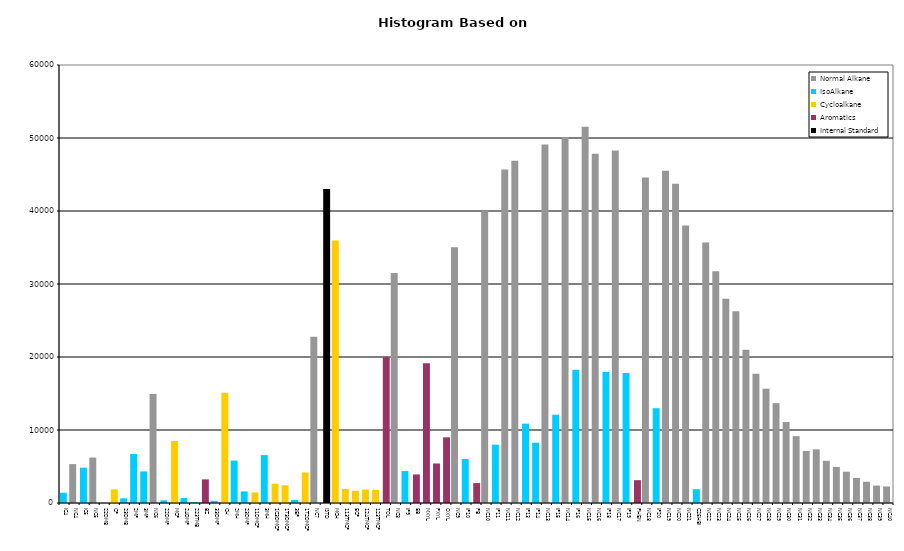
| Category | Normal Alkane | IsoAlkane | Cycloalkane | Aromatics | Internal Standard |
|---|---|---|---|---|---|
| IC4 | 0 | 1407 | 0 | 0 | 0 |
| NC4 | 5330 | 0 | 0 | 0 | 0 |
| IC5 | 0 | 4836 | 0 | 0 | 0 |
| NC5 | 6226 | 0 | 0 | 0 | 0 |
| 22DMB | 0 | 0 | 0 | 0 | 0 |
| CP | 0 | 0 | 1866 | 0 | 0 |
| 23DMB | 0 | 638 | 0 | 0 | 0 |
| 2MP | 0 | 6716 | 0 | 0 | 0 |
| 3MP | 0 | 4327 | 0 | 0 | 0 |
| NC6 | 14945 | 0 | 0 | 0 | 0 |
| 22DMP | 0 | 363 | 0 | 0 | 0 |
| MCP | 0 | 0 | 8501 | 0 | 0 |
| 24DMP | 0 | 676 | 0 | 0 | 0 |
| 223TMB | 0 | 113 | 0 | 0 | 0 |
| BZ | 0 | 0 | 0 | 3235 | 0 |
| 33DMP | 0 | 299 | 0 | 0 | 0 |
| CH | 0 | 0 | 15104 | 0 | 0 |
| 2MH | 0 | 5811 | 0 | 0 | 0 |
| 23DMP | 0 | 1588 | 0 | 0 | 0 |
| 11DMCP | 0 | 0 | 1448 | 0 | 0 |
| 3MH | 0 | 6565 | 0 | 0 | 0 |
| 1C3DMCP | 0 | 0 | 2648 | 0 | 0 |
| 1T3DMCP | 0 | 0 | 2430 | 0 | 0 |
| 3EP | 0 | 431 | 0 | 0 | 0 |
| 1T2DMCP | 0 | 0 | 4182 | 0 | 0 |
| NC7 | 22785 | 0 | 0 | 0 | 0 |
| ISTD | 0 | 0 | 0 | 0 | 43023 |
| MCH | 0 | 0 | 35963 | 0 | 0 |
| 113TMCP | 0 | 0 | 1941 | 0 | 0 |
| ECP | 0 | 0 | 1682 | 0 | 0 |
| 124TMCP | 0 | 0 | 1839 | 0 | 0 |
| 123TMCP | 0 | 0 | 1814 | 0 | 0 |
| TOL | 0 | 0 | 0 | 19953 | 0 |
| NC8 | 31517 | 0 | 0 | 0 | 0 |
| IP9 | 0 | 4375 | 0 | 0 | 0 |
| EB | 0 | 0 | 0 | 3908 | 0 |
| MXYL | 0 | 0 | 0 | 19127 | 0 |
| PXYL | 0 | 0 | 0 | 5411 | 0 |
| OXYL | 0 | 0 | 0 | 8997 | 0 |
| NC9 | 35021 | 0 | 0 | 0 | 0 |
| IP10 | 0 | 6033 | 0 | 0 | 0 |
| PB | 0 | 0 | 0 | 2729 | 0 |
| NC10 | 40064 | 0 | 0 | 0 | 0 |
| IP11 | 0 | 7996 | 0 | 0 | 0 |
| NC11 | 45702 | 0 | 0 | 0 | 0 |
| NC12 | 46894 | 0 | 0 | 0 | 0 |
| IP13 | 0 | 10869 | 0 | 0 | 0 |
| IP14 | 0 | 8262 | 0 | 0 | 0 |
| NC13 | 49094 | 0 | 0 | 0 | 0 |
| IP15 | 0 | 12097 | 0 | 0 | 0 |
| NC14 | 50137 | 0 | 0 | 0 | 0 |
| IP16 | 0 | 18253 | 0 | 0 | 0 |
| NC15 | 51550 | 0 | 0 | 0 | 0 |
| NC16 | 47827 | 0 | 0 | 0 | 0 |
| IP18 | 0 | 17952 | 0 | 0 | 0 |
| NC17 | 48275 | 0 | 0 | 0 | 0 |
| IP19 | 0 | 17815 | 0 | 0 | 0 |
| PHEN | 0 | 0 | 0 | 3127 | 0 |
| NC18 | 44577 | 0 | 0 | 0 | 0 |
| IP20 | 0 | 12989 | 0 | 0 | 0 |
| NC19 | 45510 | 0 | 0 | 0 | 0 |
| NC20 | 43729 | 0 | 0 | 0 | 0 |
| NC21 | 38011 | 0 | 0 | 0 | 0 |
| C25HBI | 0 | 1891 | 0 | 0 | 0 |
| NC22 | 35694 | 0 | 0 | 0 | 0 |
| NC23 | 31738 | 0 | 0 | 0 | 0 |
| NC24 | 27968 | 0 | 0 | 0 | 0 |
| NC25 | 26278 | 0 | 0 | 0 | 0 |
| NC26 | 20993 | 0 | 0 | 0 | 0 |
| NC27 | 17714 | 0 | 0 | 0 | 0 |
| NC28 | 15657 | 0 | 0 | 0 | 0 |
| NC29 | 13675 | 0 | 0 | 0 | 0 |
| NC30 | 11090 | 0 | 0 | 0 | 0 |
| NC31 | 9163 | 0 | 0 | 0 | 0 |
| NC32 | 7131 | 0 | 0 | 0 | 0 |
| NC33 | 7349 | 0 | 0 | 0 | 0 |
| NC34 | 5782 | 0 | 0 | 0 | 0 |
| NC35 | 4942 | 0 | 0 | 0 | 0 |
| NC36 | 4287 | 0 | 0 | 0 | 0 |
| NC37 | 3441 | 0 | 0 | 0 | 0 |
| NC38 | 2913 | 0 | 0 | 0 | 0 |
| NC39 | 2388 | 0 | 0 | 0 | 0 |
| NC40 | 2265 | 0 | 0 | 0 | 0 |